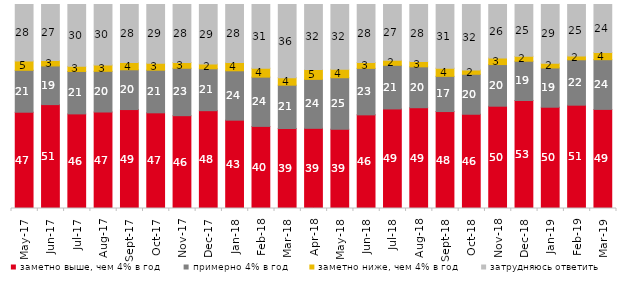
| Category | заметно выше, чем 4% в год | примерно 4% в год | заметно ниже, чем 4% в год | затрудняюсь ответить |
|---|---|---|---|---|
| 2017-05-01 | 47.2 | 20.55 | 4.55 | 27.7 |
| 2017-06-01 | 50.9 | 18.95 | 2.65 | 27.45 |
| 2017-07-01 | 46.35 | 20.8 | 2.5 | 30.3 |
| 2017-08-01 | 47.3 | 19.95 | 3.1 | 29.65 |
| 2017-09-01 | 48.5 | 19.5 | 3.55 | 28.45 |
| 2017-10-01 | 46.9 | 20.9 | 3.45 | 28.75 |
| 2017-11-01 | 45.5 | 23.25 | 2.85 | 28.4 |
| 2017-12-01 | 47.95 | 20.55 | 2.3 | 29.2 |
| 2018-01-01 | 43.3 | 24.2 | 4.05 | 28.45 |
| 2018-02-01 | 40.25 | 24.15 | 4.35 | 31.25 |
| 2018-03-01 | 39.2 | 21.25 | 3.7 | 35.85 |
| 2018-04-01 | 39.3 | 24 | 4.85 | 31.85 |
| 2018-05-01 | 38.8 | 25.3 | 4.15 | 31.75 |
| 2018-06-01 | 45.9 | 22.8 | 2.85 | 28.45 |
| 2018-07-01 | 48.8 | 21.4 | 2.45 | 27.35 |
| 2018-08-01 | 49.4 | 20.05 | 2.55 | 28 |
| 2018-09-01 | 47.5 | 17.25 | 4 | 31.2 |
| 2018-10-01 | 46.2 | 19.6 | 2.15 | 32.05 |
| 2018-11-01 | 50.15 | 20.409 | 3.244 | 26.198 |
| 2018-12-01 | 52.95 | 19.25 | 2.4 | 25.4 |
| 2019-01-01 | 49.65 | 19.25 | 2.3 | 28.8 |
| 2019-02-01 | 50.65 | 22.25 | 1.9 | 25.2 |
| 2019-03-01 | 48.583 | 24.366 | 3.531 | 23.521 |